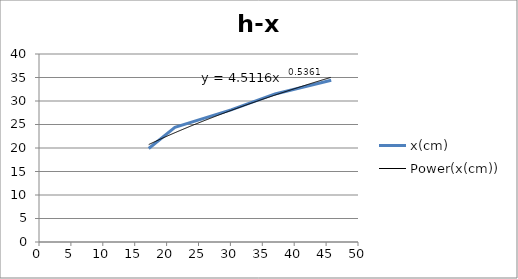
| Category | x(cm) |
|---|---|
| 17.2 | 19.9 |
| 21.3 | 24.4 |
| 30.1 | 28.1 |
| 37.0 | 31.5 |
| 45.8 | 34.4 |